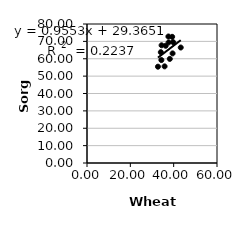
| Category | Series 0 |
|---|---|
| 34.42797621988373 | 67.744 |
| 37.674233622307625 | 69.396 |
| 34.07033276931754 | 63.779 |
| 32.74831966554108 | 55.428 |
| 39.49809468822171 | 63.077 |
| 34.33337954699063 | 59.256 |
| 39.30463185736365 | 72.616 |
| 38.21342007909172 | 59.912 |
| 37.57456694188117 | 72.805 |
| 35.812470260070555 | 55.614 |
| 36.31403054332798 | 67.471 |
| 39.740031772496344 | 69.546 |
| 43.2652760860739 | 66.469 |